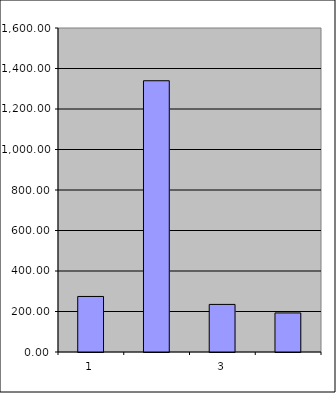
| Category | Series 0 |
|---|---|
| 0 | 274.25 |
| 1 | 1339.554 |
| 2 | 234.962 |
| 3 | 192.952 |